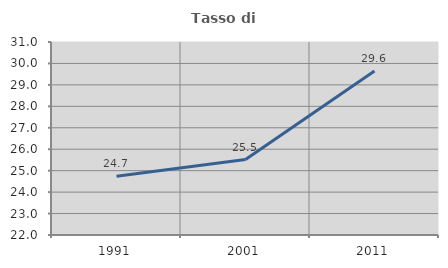
| Category | Tasso di occupazione   |
|---|---|
| 1991.0 | 24.743 |
| 2001.0 | 25.52 |
| 2011.0 | 29.65 |